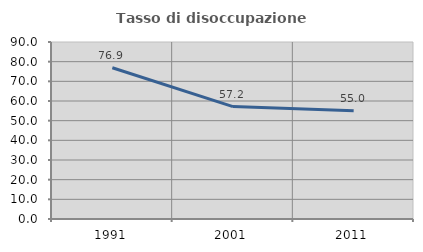
| Category | Tasso di disoccupazione giovanile  |
|---|---|
| 1991.0 | 76.923 |
| 2001.0 | 57.173 |
| 2011.0 | 55.028 |